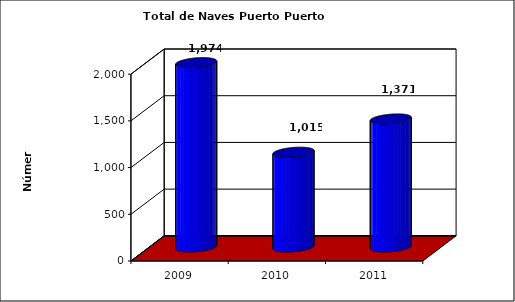
| Category | Series 0 |
|---|---|
| 2009.0 | 1974 |
| 2010.0 | 1015 |
| 2011.0 | 1371 |